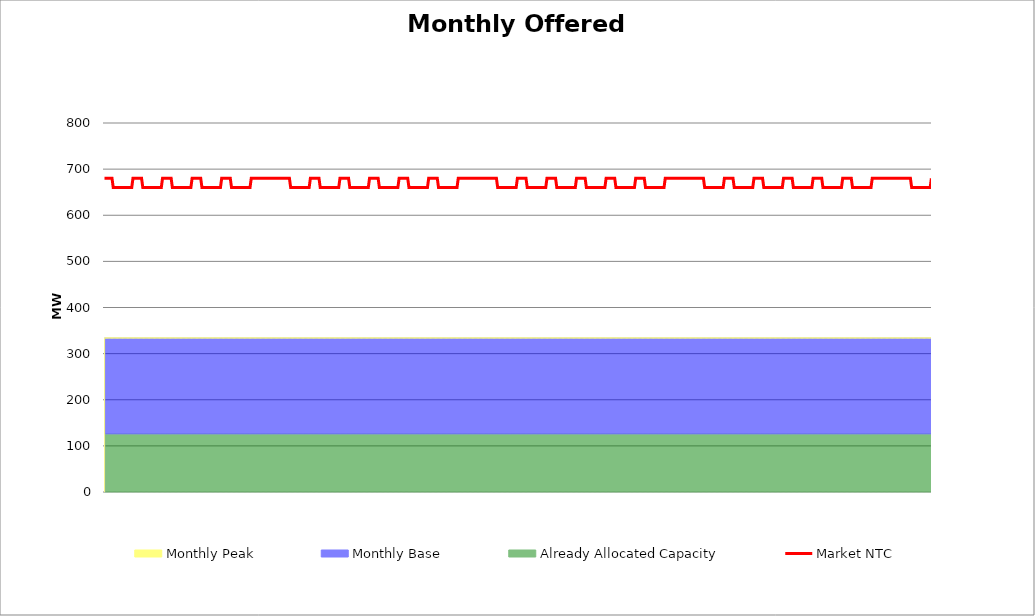
| Category | Market NTC |
|---|---|
| 0 | 680 |
| 1 | 680 |
| 2 | 680 |
| 3 | 680 |
| 4 | 680 |
| 5 | 680 |
| 6 | 680 |
| 7 | 660 |
| 8 | 660 |
| 9 | 660 |
| 10 | 660 |
| 11 | 660 |
| 12 | 660 |
| 13 | 660 |
| 14 | 660 |
| 15 | 660 |
| 16 | 660 |
| 17 | 660 |
| 18 | 660 |
| 19 | 660 |
| 20 | 660 |
| 21 | 660 |
| 22 | 660 |
| 23 | 680 |
| 24 | 680 |
| 25 | 680 |
| 26 | 680 |
| 27 | 680 |
| 28 | 680 |
| 29 | 680 |
| 30 | 680 |
| 31 | 660 |
| 32 | 660 |
| 33 | 660 |
| 34 | 660 |
| 35 | 660 |
| 36 | 660 |
| 37 | 660 |
| 38 | 660 |
| 39 | 660 |
| 40 | 660 |
| 41 | 660 |
| 42 | 660 |
| 43 | 660 |
| 44 | 660 |
| 45 | 660 |
| 46 | 660 |
| 47 | 680 |
| 48 | 680 |
| 49 | 680 |
| 50 | 680 |
| 51 | 680 |
| 52 | 680 |
| 53 | 680 |
| 54 | 680 |
| 55 | 660 |
| 56 | 660 |
| 57 | 660 |
| 58 | 660 |
| 59 | 660 |
| 60 | 660 |
| 61 | 660 |
| 62 | 660 |
| 63 | 660 |
| 64 | 660 |
| 65 | 660 |
| 66 | 660 |
| 67 | 660 |
| 68 | 660 |
| 69 | 660 |
| 70 | 660 |
| 71 | 680 |
| 72 | 680 |
| 73 | 680 |
| 74 | 680 |
| 75 | 680 |
| 76 | 680 |
| 77 | 680 |
| 78 | 680 |
| 79 | 660 |
| 80 | 660 |
| 81 | 660 |
| 82 | 660 |
| 83 | 660 |
| 84 | 660 |
| 85 | 660 |
| 86 | 660 |
| 87 | 660 |
| 88 | 660 |
| 89 | 660 |
| 90 | 660 |
| 91 | 660 |
| 92 | 660 |
| 93 | 660 |
| 94 | 660 |
| 95 | 680 |
| 96 | 680 |
| 97 | 680 |
| 98 | 680 |
| 99 | 680 |
| 100 | 680 |
| 101 | 680 |
| 102 | 680 |
| 103 | 660 |
| 104 | 660 |
| 105 | 660 |
| 106 | 660 |
| 107 | 660 |
| 108 | 660 |
| 109 | 660 |
| 110 | 660 |
| 111 | 660 |
| 112 | 660 |
| 113 | 660 |
| 114 | 660 |
| 115 | 660 |
| 116 | 660 |
| 117 | 660 |
| 118 | 660 |
| 119 | 680 |
| 120 | 680 |
| 121 | 680 |
| 122 | 680 |
| 123 | 680 |
| 124 | 680 |
| 125 | 680 |
| 126 | 680 |
| 127 | 680 |
| 128 | 680 |
| 129 | 680 |
| 130 | 680 |
| 131 | 680 |
| 132 | 680 |
| 133 | 680 |
| 134 | 680 |
| 135 | 680 |
| 136 | 680 |
| 137 | 680 |
| 138 | 680 |
| 139 | 680 |
| 140 | 680 |
| 141 | 680 |
| 142 | 680 |
| 143 | 680 |
| 144 | 680 |
| 145 | 680 |
| 146 | 680 |
| 147 | 680 |
| 148 | 680 |
| 149 | 680 |
| 150 | 680 |
| 151 | 660 |
| 152 | 660 |
| 153 | 660 |
| 154 | 660 |
| 155 | 660 |
| 156 | 660 |
| 157 | 660 |
| 158 | 660 |
| 159 | 660 |
| 160 | 660 |
| 161 | 660 |
| 162 | 660 |
| 163 | 660 |
| 164 | 660 |
| 165 | 660 |
| 166 | 660 |
| 167 | 680 |
| 168 | 680 |
| 169 | 680 |
| 170 | 680 |
| 171 | 680 |
| 172 | 680 |
| 173 | 680 |
| 174 | 680 |
| 175 | 660 |
| 176 | 660 |
| 177 | 660 |
| 178 | 660 |
| 179 | 660 |
| 180 | 660 |
| 181 | 660 |
| 182 | 660 |
| 183 | 660 |
| 184 | 660 |
| 185 | 660 |
| 186 | 660 |
| 187 | 660 |
| 188 | 660 |
| 189 | 660 |
| 190 | 660 |
| 191 | 680 |
| 192 | 680 |
| 193 | 680 |
| 194 | 680 |
| 195 | 680 |
| 196 | 680 |
| 197 | 680 |
| 198 | 680 |
| 199 | 660 |
| 200 | 660 |
| 201 | 660 |
| 202 | 660 |
| 203 | 660 |
| 204 | 660 |
| 205 | 660 |
| 206 | 660 |
| 207 | 660 |
| 208 | 660 |
| 209 | 660 |
| 210 | 660 |
| 211 | 660 |
| 212 | 660 |
| 213 | 660 |
| 214 | 660 |
| 215 | 680 |
| 216 | 680 |
| 217 | 680 |
| 218 | 680 |
| 219 | 680 |
| 220 | 680 |
| 221 | 680 |
| 222 | 680 |
| 223 | 660 |
| 224 | 660 |
| 225 | 660 |
| 226 | 660 |
| 227 | 660 |
| 228 | 660 |
| 229 | 660 |
| 230 | 660 |
| 231 | 660 |
| 232 | 660 |
| 233 | 660 |
| 234 | 660 |
| 235 | 660 |
| 236 | 660 |
| 237 | 660 |
| 238 | 660 |
| 239 | 680 |
| 240 | 680 |
| 241 | 680 |
| 242 | 680 |
| 243 | 680 |
| 244 | 680 |
| 245 | 680 |
| 246 | 680 |
| 247 | 660 |
| 248 | 660 |
| 249 | 660 |
| 250 | 660 |
| 251 | 660 |
| 252 | 660 |
| 253 | 660 |
| 254 | 660 |
| 255 | 660 |
| 256 | 660 |
| 257 | 660 |
| 258 | 660 |
| 259 | 660 |
| 260 | 660 |
| 261 | 660 |
| 262 | 660 |
| 263 | 680 |
| 264 | 680 |
| 265 | 680 |
| 266 | 680 |
| 267 | 680 |
| 268 | 680 |
| 269 | 680 |
| 270 | 680 |
| 271 | 660 |
| 272 | 660 |
| 273 | 660 |
| 274 | 660 |
| 275 | 660 |
| 276 | 660 |
| 277 | 660 |
| 278 | 660 |
| 279 | 660 |
| 280 | 660 |
| 281 | 660 |
| 282 | 660 |
| 283 | 660 |
| 284 | 660 |
| 285 | 660 |
| 286 | 660 |
| 287 | 680 |
| 288 | 680 |
| 289 | 680 |
| 290 | 680 |
| 291 | 680 |
| 292 | 680 |
| 293 | 680 |
| 294 | 680 |
| 295 | 680 |
| 296 | 680 |
| 297 | 680 |
| 298 | 680 |
| 299 | 680 |
| 300 | 680 |
| 301 | 680 |
| 302 | 680 |
| 303 | 680 |
| 304 | 680 |
| 305 | 680 |
| 306 | 680 |
| 307 | 680 |
| 308 | 680 |
| 309 | 680 |
| 310 | 680 |
| 311 | 680 |
| 312 | 680 |
| 313 | 680 |
| 314 | 680 |
| 315 | 680 |
| 316 | 680 |
| 317 | 680 |
| 318 | 680 |
| 319 | 660 |
| 320 | 660 |
| 321 | 660 |
| 322 | 660 |
| 323 | 660 |
| 324 | 660 |
| 325 | 660 |
| 326 | 660 |
| 327 | 660 |
| 328 | 660 |
| 329 | 660 |
| 330 | 660 |
| 331 | 660 |
| 332 | 660 |
| 333 | 660 |
| 334 | 660 |
| 335 | 680 |
| 336 | 680 |
| 337 | 680 |
| 338 | 680 |
| 339 | 680 |
| 340 | 680 |
| 341 | 680 |
| 342 | 680 |
| 343 | 660 |
| 344 | 660 |
| 345 | 660 |
| 346 | 660 |
| 347 | 660 |
| 348 | 660 |
| 349 | 660 |
| 350 | 660 |
| 351 | 660 |
| 352 | 660 |
| 353 | 660 |
| 354 | 660 |
| 355 | 660 |
| 356 | 660 |
| 357 | 660 |
| 358 | 660 |
| 359 | 680 |
| 360 | 680 |
| 361 | 680 |
| 362 | 680 |
| 363 | 680 |
| 364 | 680 |
| 365 | 680 |
| 366 | 680 |
| 367 | 660 |
| 368 | 660 |
| 369 | 660 |
| 370 | 660 |
| 371 | 660 |
| 372 | 660 |
| 373 | 660 |
| 374 | 660 |
| 375 | 660 |
| 376 | 660 |
| 377 | 660 |
| 378 | 660 |
| 379 | 660 |
| 380 | 660 |
| 381 | 660 |
| 382 | 660 |
| 383 | 680 |
| 384 | 680 |
| 385 | 680 |
| 386 | 680 |
| 387 | 680 |
| 388 | 680 |
| 389 | 680 |
| 390 | 680 |
| 391 | 660 |
| 392 | 660 |
| 393 | 660 |
| 394 | 660 |
| 395 | 660 |
| 396 | 660 |
| 397 | 660 |
| 398 | 660 |
| 399 | 660 |
| 400 | 660 |
| 401 | 660 |
| 402 | 660 |
| 403 | 660 |
| 404 | 660 |
| 405 | 660 |
| 406 | 660 |
| 407 | 680 |
| 408 | 680 |
| 409 | 680 |
| 410 | 680 |
| 411 | 680 |
| 412 | 680 |
| 413 | 680 |
| 414 | 680 |
| 415 | 660 |
| 416 | 660 |
| 417 | 660 |
| 418 | 660 |
| 419 | 660 |
| 420 | 660 |
| 421 | 660 |
| 422 | 660 |
| 423 | 660 |
| 424 | 660 |
| 425 | 660 |
| 426 | 660 |
| 427 | 660 |
| 428 | 660 |
| 429 | 660 |
| 430 | 660 |
| 431 | 680 |
| 432 | 680 |
| 433 | 680 |
| 434 | 680 |
| 435 | 680 |
| 436 | 680 |
| 437 | 680 |
| 438 | 680 |
| 439 | 660 |
| 440 | 660 |
| 441 | 660 |
| 442 | 660 |
| 443 | 660 |
| 444 | 660 |
| 445 | 660 |
| 446 | 660 |
| 447 | 660 |
| 448 | 660 |
| 449 | 660 |
| 450 | 660 |
| 451 | 660 |
| 452 | 660 |
| 453 | 660 |
| 454 | 660 |
| 455 | 680 |
| 456 | 680 |
| 457 | 680 |
| 458 | 680 |
| 459 | 680 |
| 460 | 680 |
| 461 | 680 |
| 462 | 680 |
| 463 | 680 |
| 464 | 680 |
| 465 | 680 |
| 466 | 680 |
| 467 | 680 |
| 468 | 680 |
| 469 | 680 |
| 470 | 680 |
| 471 | 680 |
| 472 | 680 |
| 473 | 680 |
| 474 | 680 |
| 475 | 680 |
| 476 | 680 |
| 477 | 680 |
| 478 | 680 |
| 479 | 680 |
| 480 | 680 |
| 481 | 680 |
| 482 | 680 |
| 483 | 680 |
| 484 | 680 |
| 485 | 680 |
| 486 | 680 |
| 487 | 660 |
| 488 | 660 |
| 489 | 660 |
| 490 | 660 |
| 491 | 660 |
| 492 | 660 |
| 493 | 660 |
| 494 | 660 |
| 495 | 660 |
| 496 | 660 |
| 497 | 660 |
| 498 | 660 |
| 499 | 660 |
| 500 | 660 |
| 501 | 660 |
| 502 | 660 |
| 503 | 680 |
| 504 | 680 |
| 505 | 680 |
| 506 | 680 |
| 507 | 680 |
| 508 | 680 |
| 509 | 680 |
| 510 | 680 |
| 511 | 660 |
| 512 | 660 |
| 513 | 660 |
| 514 | 660 |
| 515 | 660 |
| 516 | 660 |
| 517 | 660 |
| 518 | 660 |
| 519 | 660 |
| 520 | 660 |
| 521 | 660 |
| 522 | 660 |
| 523 | 660 |
| 524 | 660 |
| 525 | 660 |
| 526 | 660 |
| 527 | 680 |
| 528 | 680 |
| 529 | 680 |
| 530 | 680 |
| 531 | 680 |
| 532 | 680 |
| 533 | 680 |
| 534 | 680 |
| 535 | 660 |
| 536 | 660 |
| 537 | 660 |
| 538 | 660 |
| 539 | 660 |
| 540 | 660 |
| 541 | 660 |
| 542 | 660 |
| 543 | 660 |
| 544 | 660 |
| 545 | 660 |
| 546 | 660 |
| 547 | 660 |
| 548 | 660 |
| 549 | 660 |
| 550 | 660 |
| 551 | 680 |
| 552 | 680 |
| 553 | 680 |
| 554 | 680 |
| 555 | 680 |
| 556 | 680 |
| 557 | 680 |
| 558 | 680 |
| 559 | 660 |
| 560 | 660 |
| 561 | 660 |
| 562 | 660 |
| 563 | 660 |
| 564 | 660 |
| 565 | 660 |
| 566 | 660 |
| 567 | 660 |
| 568 | 660 |
| 569 | 660 |
| 570 | 660 |
| 571 | 660 |
| 572 | 660 |
| 573 | 660 |
| 574 | 660 |
| 575 | 680 |
| 576 | 680 |
| 577 | 680 |
| 578 | 680 |
| 579 | 680 |
| 580 | 680 |
| 581 | 680 |
| 582 | 680 |
| 583 | 660 |
| 584 | 660 |
| 585 | 660 |
| 586 | 660 |
| 587 | 660 |
| 588 | 660 |
| 589 | 660 |
| 590 | 660 |
| 591 | 660 |
| 592 | 660 |
| 593 | 660 |
| 594 | 660 |
| 595 | 660 |
| 596 | 660 |
| 597 | 660 |
| 598 | 660 |
| 599 | 680 |
| 600 | 680 |
| 601 | 680 |
| 602 | 680 |
| 603 | 680 |
| 604 | 680 |
| 605 | 680 |
| 606 | 680 |
| 607 | 660 |
| 608 | 660 |
| 609 | 660 |
| 610 | 660 |
| 611 | 660 |
| 612 | 660 |
| 613 | 660 |
| 614 | 660 |
| 615 | 660 |
| 616 | 660 |
| 617 | 660 |
| 618 | 660 |
| 619 | 660 |
| 620 | 660 |
| 621 | 660 |
| 622 | 660 |
| 623 | 680 |
| 624 | 680 |
| 625 | 680 |
| 626 | 680 |
| 627 | 680 |
| 628 | 680 |
| 629 | 680 |
| 630 | 680 |
| 631 | 680 |
| 632 | 680 |
| 633 | 680 |
| 634 | 680 |
| 635 | 680 |
| 636 | 680 |
| 637 | 680 |
| 638 | 680 |
| 639 | 680 |
| 640 | 680 |
| 641 | 680 |
| 642 | 680 |
| 643 | 680 |
| 644 | 680 |
| 645 | 680 |
| 646 | 680 |
| 647 | 680 |
| 648 | 680 |
| 649 | 680 |
| 650 | 680 |
| 651 | 680 |
| 652 | 680 |
| 653 | 680 |
| 654 | 680 |
| 655 | 660 |
| 656 | 660 |
| 657 | 660 |
| 658 | 660 |
| 659 | 660 |
| 660 | 660 |
| 661 | 660 |
| 662 | 660 |
| 663 | 660 |
| 664 | 660 |
| 665 | 660 |
| 666 | 660 |
| 667 | 660 |
| 668 | 660 |
| 669 | 660 |
| 670 | 660 |
| 671 | 680 |